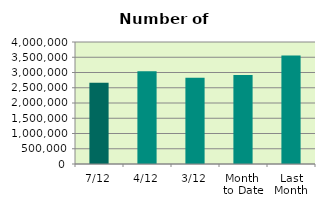
| Category | Series 0 |
|---|---|
| 7/12 | 2662650 |
| 4/12 | 3037348 |
| 3/12 | 2824550 |
| Month 
to Date | 2914428.4 |
| Last
Month | 3558191.714 |